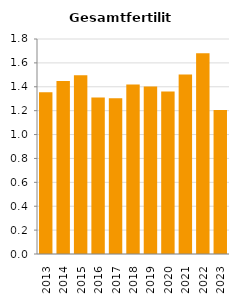
| Category | Gesamtfertilität |
|---|---|
| 2013.0 | 1.354 |
| 2014.0 | 1.448 |
| 2015.0 | 1.497 |
| 2016.0 | 1.311 |
| 2017.0 | 1.304 |
| 2018.0 | 1.418 |
| 2019.0 | 1.403 |
| 2020.0 | 1.36 |
| 2021.0 | 1.504 |
| 2022.0 | 1.68 |
| 2023.0 | 1.205 |